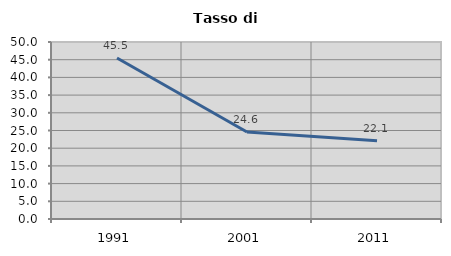
| Category | Tasso di disoccupazione   |
|---|---|
| 1991.0 | 45.477 |
| 2001.0 | 24.567 |
| 2011.0 | 22.097 |